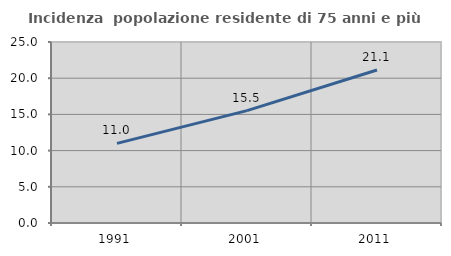
| Category | Incidenza  popolazione residente di 75 anni e più |
|---|---|
| 1991.0 | 11.003 |
| 2001.0 | 15.527 |
| 2011.0 | 21.134 |